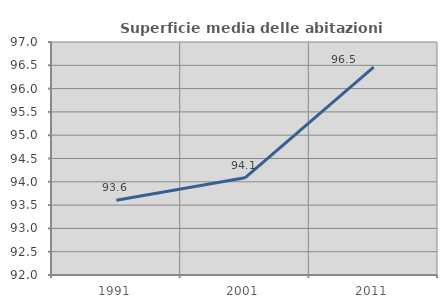
| Category | Superficie media delle abitazioni occupate |
|---|---|
| 1991.0 | 93.602 |
| 2001.0 | 94.086 |
| 2011.0 | 96.459 |